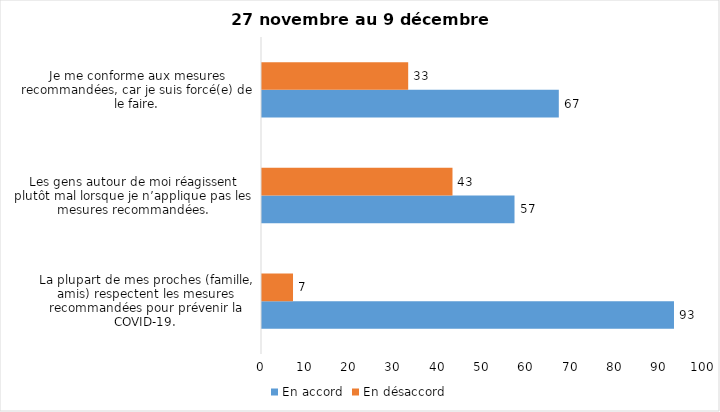
| Category | En accord | En désaccord |
|---|---|---|
| La plupart de mes proches (famille, amis) respectent les mesures recommandées pour prévenir la COVID-19. | 93 | 7 |
| Les gens autour de moi réagissent plutôt mal lorsque je n’applique pas les mesures recommandées. | 57 | 43 |
| Je me conforme aux mesures recommandées, car je suis forcé(e) de le faire. | 67 | 33 |